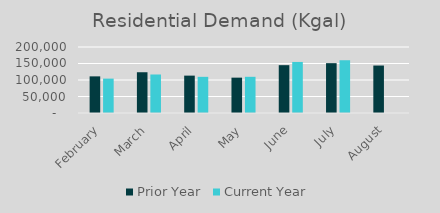
| Category | Prior Year | Current Year |
|---|---|---|
| February | 111009.962 | 104204.224 |
| March | 123525.131 | 116687.491 |
| April | 113258.787 | 109598.965 |
| May | 107128.051 | 109656.015 |
| June | 144930.453 | 154696.236 |
| July | 151028.014 | 159889.353 |
| August | 143816.337 | 0 |